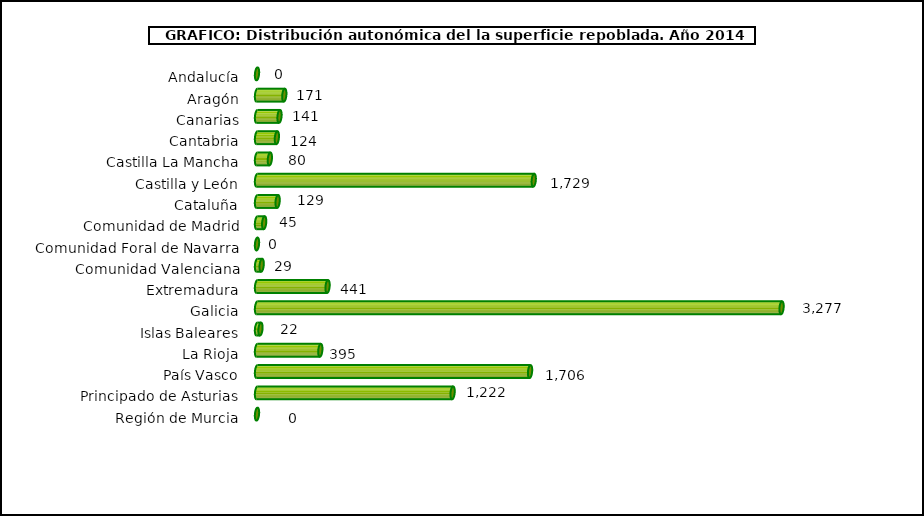
| Category | Series 1 |
|---|---|
| Andalucía | 0 |
| Aragón | 170.5 |
| Canarias | 140.54 |
| Cantabria | 124.11 |
| Castilla La Mancha | 80.22 |
| Castilla y León | 1728.75 |
| Cataluña | 128.77 |
| Comunidad de Madrid | 44.72 |
| Comunidad Foral de Navarra | 0 |
| Comunidad Valenciana | 29.1 |
| Extremadura | 440.69 |
| Galicia | 3276.7 |
| Islas Baleares | 21.61 |
| La Rioja | 395.48 |
| País Vasco | 1705.66 |
| Principado de Asturias | 1221.81 |
| Región de Murcia | 0 |